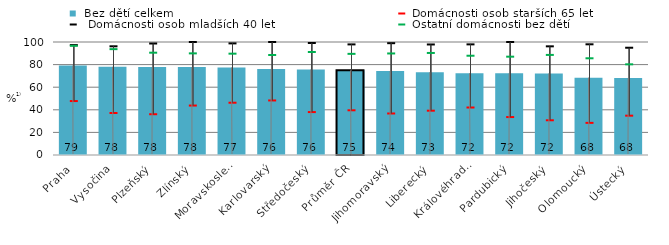
| Category |  Bez dětí celkem |
|---|---|
| Praha | 79.188 |
| Vysočina | 78.012 |
| Plzeňský | 77.903 |
| Zlínský | 77.845 |
| Moravskoslezský | 77.454 |
| Karlovarský | 76.172 |
| Středočeský | 75.714 |
| Průměr ČR | 74.891 |
| Jihomoravský | 74.373 |
| Liberecký | 73.261 |
| Královéhradecký | 72.334 |
| Pardubický | 72.321 |
| Jihočeský | 72.218 |
| Olomoucký | 68.466 |
| Ústecký | 68.214 |